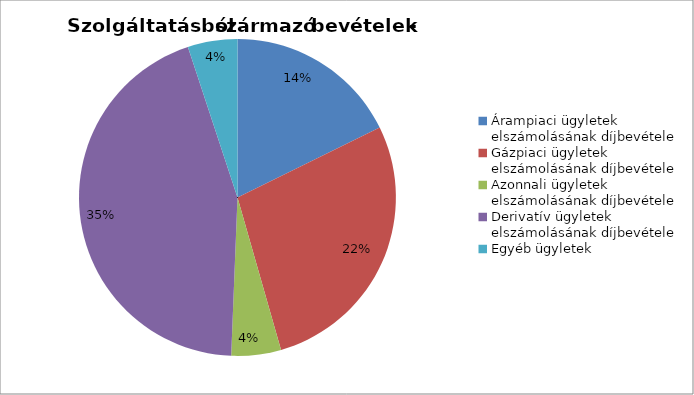
| Category | Series 0 |
|---|---|
| Árampiaci ügyletek elszámolásának díjbevétele | 0.14 |
| Gázpiaci ügyletek elszámolásának díjbevétele | 0.22 |
| Azonnali ügyletek elszámolásának díjbevétele | 0.04 |
| Derivatív ügyletek elszámolásának díjbevétele | 0.35 |
| Egyéb ügyletek | 0.04 |